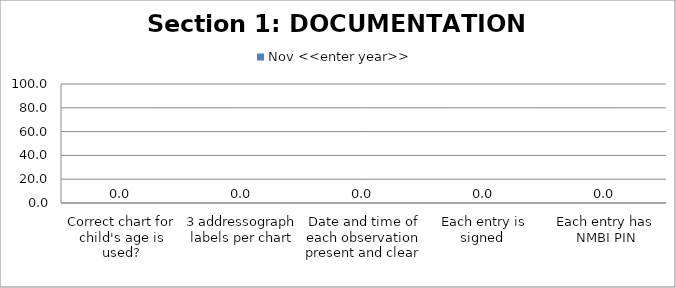
| Category | Nov <<enter year>> |
|---|---|
| Correct chart for child's age is used? | 0 |
| 3 addressograph labels per chart | 0 |
| Date and time of each observation present and clear  | 0 |
| Each entry is signed  | 0 |
| Each entry has NMBI PIN | 0 |